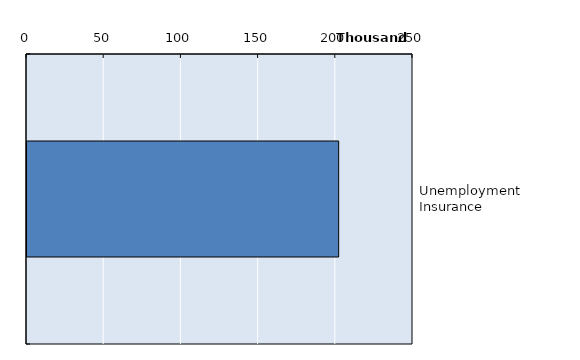
| Category | Series 0 |
|---|---|
| Unemployment Insurance | 201866.085 |